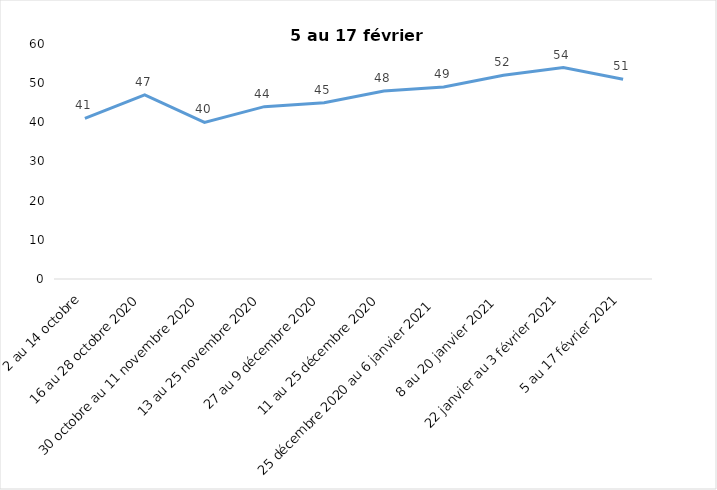
| Category | Toujours aux trois mesures |
|---|---|
| 2 au 14 octobre | 41 |
| 16 au 28 octobre 2020 | 47 |
| 30 octobre au 11 novembre 2020 | 40 |
| 13 au 25 novembre 2020 | 44 |
| 27 au 9 décembre 2020 | 45 |
| 11 au 25 décembre 2020 | 48 |
| 25 décembre 2020 au 6 janvier 2021 | 49 |
| 8 au 20 janvier 2021 | 52 |
| 22 janvier au 3 février 2021 | 54 |
| 5 au 17 février 2021 | 51 |